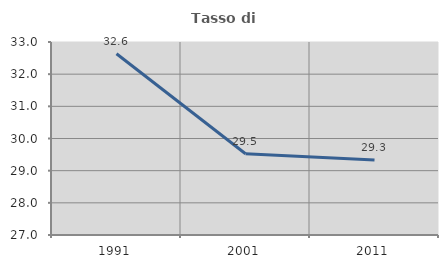
| Category | Tasso di occupazione   |
|---|---|
| 1991.0 | 32.636 |
| 2001.0 | 29.527 |
| 2011.0 | 29.335 |